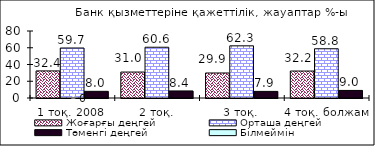
| Category | Жоғарғы деңгей | Орташа деңгей | Төменгі деңгей |
|---|---|---|---|
| 1 тоқ. 2008  | 32.35 | 59.69 | 7.96 |
| 2 тоқ. | 30.98 | 60.6 | 8.42 |
| 3 тоқ. | 29.86 | 62.26 | 7.88 |
| 4 тоқ. болжам | 32.19 | 58.78 | 9.03 |